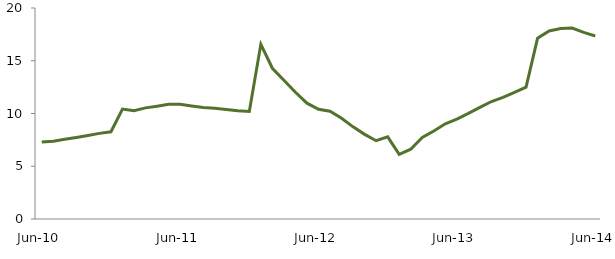
| Category | Series 0 |
|---|---|
| Jun-10 | 7.288 |
|  | 7.37 |
|  | 7.556 |
|  | 7.725 |
|  | 7.91 |
|  | 8.116 |
|  | 8.269 |
|  | 10.421 |
|  | 10.256 |
|  | 10.532 |
|  | 10.695 |
|  | 10.88 |
| Jun-11 | 10.867 |
|  | 10.717 |
|  | 10.566 |
|  | 10.492 |
|  | 10.372 |
|  | 10.261 |
|  | 10.197 |
|  | 16.554 |
|  | 14.287 |
|  | 13.149 |
|  | 12.01 |
|  | 10.979 |
| Jun-12 | 10.402 |
|  | 10.221 |
|  | 9.554 |
|  | 8.736 |
|  | 8.023 |
|  | 7.421 |
|  | 7.783 |
|  | 6.12 |
|  | 6.613 |
|  | 7.721 |
|  | 8.337 |
|  | 9.021 |
| Jun-13 | 9.471 |
|  | 10.005 |
|  | 10.58 |
|  | 11.134 |
|  | 11.529 |
|  | 12.009 |
|  | 12.5 |
|  | 17.13 |
|  | 17.828 |
|  | 18.046 |
|  | 18.095 |
|  | 17.683 |
| Jun-14 | 17.351 |